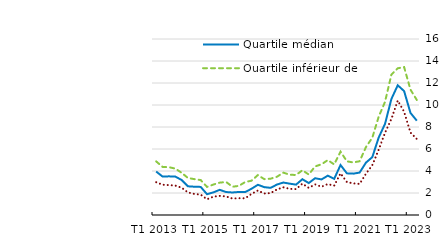
| Category | Quartile médian | Quartile inférieur de revenu | Quartile supérieur de revenu |
|---|---|---|---|
| T1 2013 | 3.95 | 4.874 | 2.981 |
| T2 2013 | 3.497 | 4.374 | 2.751 |
| T3 2013 | 3.514 | 4.347 | 2.718 |
| T4 2013 | 3.496 | 4.22 | 2.675 |
| T1 2014 | 3.183 | 3.84 | 2.484 |
| T2 2014 | 2.609 | 3.363 | 2.056 |
| T3 2014 | 2.572 | 3.262 | 1.913 |
| T4 2014 | 2.554 | 3.178 | 1.855 |
| T1 2015 | 1.89 | 2.555 | 1.43 |
| T2 2015 | 2.059 | 2.769 | 1.668 |
| T3 2015 | 2.285 | 2.943 | 1.738 |
| T4 2015 | 2.088 | 3.002 | 1.684 |
| T1 2016 | 2.048 | 2.569 | 1.497 |
| T2 2016 | 2.095 | 2.646 | 1.528 |
| T3 2016 | 2.085 | 2.997 | 1.519 |
| T4 2016 | 2.386 | 3.118 | 1.918 |
| T1 2017 | 2.749 | 3.632 | 2.229 |
| T2 2017 | 2.533 | 3.26 | 1.955 |
| T3 2017 | 2.468 | 3.299 | 1.993 |
| T4 2017 | 2.769 | 3.478 | 2.326 |
| T1 2018 | 2.951 | 3.851 | 2.517 |
| T2 2018 | 2.85 | 3.659 | 2.374 |
| T3 2018 | 2.762 | 3.639 | 2.354 |
| T4 2018 | 3.254 | 4.065 | 2.846 |
| T1 2019 | 2.902 | 3.682 | 2.466 |
| T2 2019 | 3.345 | 4.414 | 2.784 |
| T3 2019 | 3.231 | 4.61 | 2.569 |
| T4 2019 | 3.575 | 4.99 | 2.811 |
| T1 2020 | 3.284 | 4.599 | 2.666 |
| T2 2020 | 4.543 | 5.766 | 3.783 |
| T3 2020 | 3.787 | 4.88 | 2.993 |
| T4 2020 | 3.76 | 4.779 | 2.877 |
| T1 2021 | 3.856 | 4.887 | 2.823 |
| T2 2021 | 4.762 | 6.175 | 3.752 |
| T3 2021 | 5.262 | 7.028 | 4.535 |
| T4 2021 | 7.038 | 8.936 | 5.932 |
| T1 2022 | 8.289 | 10.291 | 7.48 |
| T2 2022 | 10.548 | 12.764 | 8.731 |
| T3 2022 | 11.794 | 13.338 | 10.403 |
| T4 2022 | 11.265 | 13.45 | 9.387 |
| T1 2023 | 9.285 | 11.398 | 7.491 |
| T2 2023 | 8.571 | 10.456 | 6.914 |